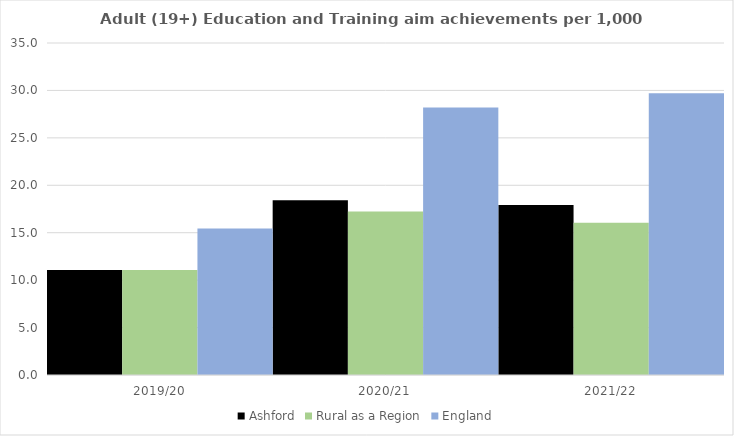
| Category | Ashford | Rural as a Region | England |
|---|---|---|---|
| 2019/20 | 11.064 | 11.081 | 15.446 |
| 2020/21 | 18.409 | 17.224 | 28.211 |
| 2021/22 | 17.924 | 16.063 | 29.711 |